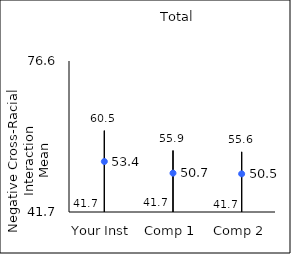
| Category | 25th percentile | 75th percentile | Mean |
|---|---|---|---|
| Your Inst | 41.7 | 60.5 | 53.37 |
| Comp 1 | 41.7 | 55.9 | 50.68 |
| Comp 2 | 41.7 | 55.6 | 50.52 |